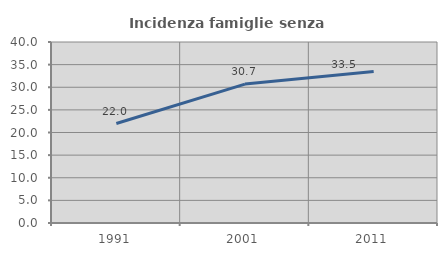
| Category | Incidenza famiglie senza nuclei |
|---|---|
| 1991.0 | 21.981 |
| 2001.0 | 30.705 |
| 2011.0 | 33.473 |